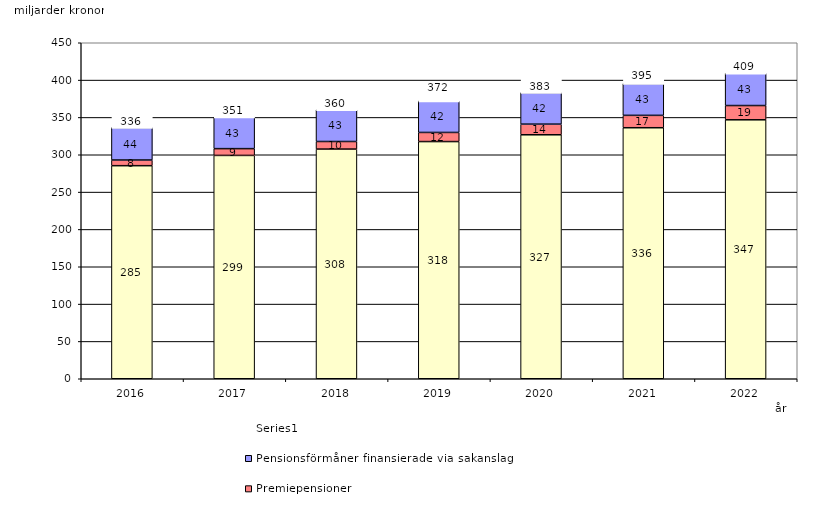
| Category | Inkomstpension och tilläggspension m.m. | Premiepensioner | Pensionsförmåner finansierade via sakanslag | Series 0 |
|---|---|---|---|---|
| 2016.0 | 285.357 | 7.598 | 43.541 | 20 |
| 2017.0 | 299.103 | 9.081 | 42.508 | 20 |
| 2018.0 | 307.608 | 10.14 | 42.565 | 20 |
| 2019.0 | 317.655 | 12.221 | 42.256 | 20 |
| 2020.0 | 326.756 | 14.229 | 42.306 | 20 |
| 2021.0 | 336.202 | 16.573 | 42.639 | 20 |
| 2022.0 | 346.822 | 19.089 | 43.297 | 20 |